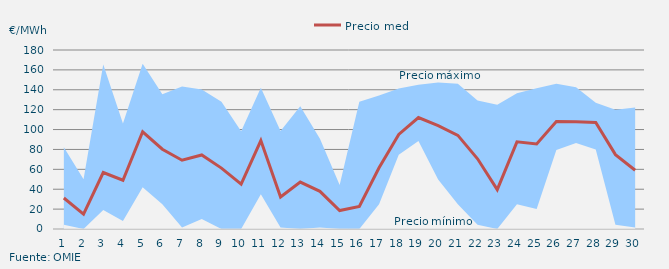
| Category | Precio medio |
|---|---|
| 1.0 | 31.139 |
| 2.0 | 14.94 |
| 3.0 | 56.817 |
| 4.0 | 49.04 |
| 5.0 | 97.785 |
| 6.0 | 80.242 |
| 7.0 | 69.119 |
| 8.0 | 74.479 |
| 9.0 | 61.251 |
| 10.0 | 45.061 |
| 11.0 | 88.916 |
| 12.0 | 32.164 |
| 13.0 | 47.22 |
| 14.0 | 37.872 |
| 15.0 | 18.562 |
| 16.0 | 22.615 |
| 17.0 | 61.589 |
| 18.0 | 95.07 |
| 19.0 | 112.063 |
| 20.0 | 104.002 |
| 21.0 | 94.144 |
| 22.0 | 70.583 |
| 23.0 | 39.568 |
| 24.0 | 87.646 |
| 25.0 | 85.466 |
| 26.0 | 108.181 |
| 27.0 | 107.915 |
| 28.0 | 107.033 |
| 29.0 | 74.798 |
| 30.0 | 59.109 |